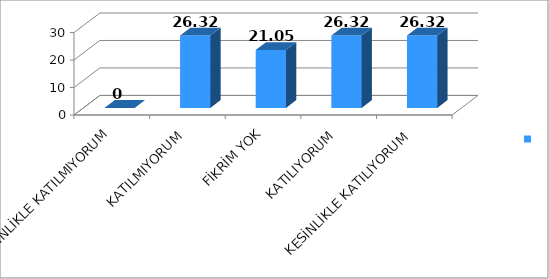
| Category | Series 0 |
|---|---|
| KESİNLİKLE KATILMIYORUM | 0 |
| KATILMIYORUM | 26.32 |
| FİKRİM YOK | 21.05 |
| KATILIYORUM | 26.32 |
| KESİNLİKLE KATILIYORUM | 26.32 |